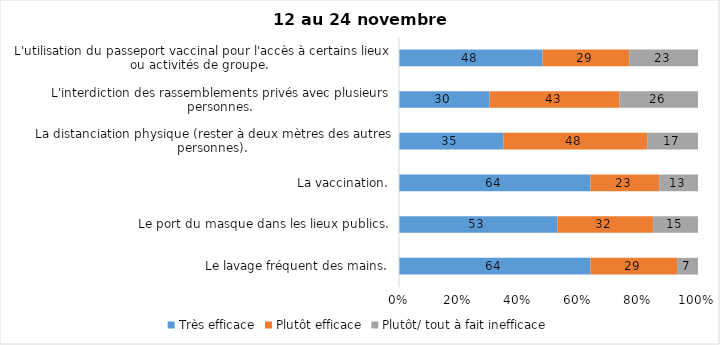
| Category | Très efficace | Plutôt efficace | Plutôt/ tout à fait inefficace |
|---|---|---|---|
| Le lavage fréquent des mains. | 64 | 29 | 7 |
| Le port du masque dans les lieux publics. | 53 | 32 | 15 |
| La vaccination. | 64 | 23 | 13 |
| La distanciation physique (rester à deux mètres des autres personnes). | 35 | 48 | 17 |
| L'interdiction des rassemblements privés avec plusieurs personnes. | 30 | 43 | 26 |
| L'utilisation du passeport vaccinal pour l'accès à certains lieux ou activités de groupe.  | 48 | 29 | 23 |